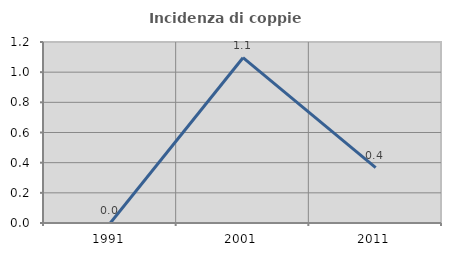
| Category | Incidenza di coppie miste |
|---|---|
| 1991.0 | 0 |
| 2001.0 | 1.096 |
| 2011.0 | 0.368 |